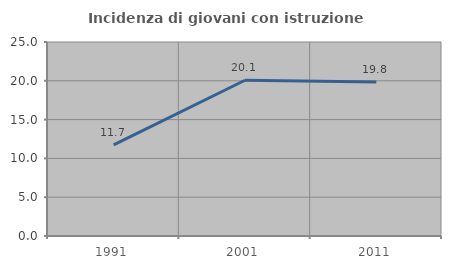
| Category | Incidenza di giovani con istruzione universitaria |
|---|---|
| 1991.0 | 11.742 |
| 2001.0 | 20.073 |
| 2011.0 | 19.841 |